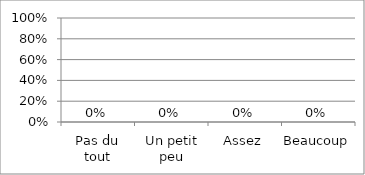
| Category | Series 0 |
|---|---|
| Pas du tout | 0 |
| Un petit peu | 0 |
| Assez | 0 |
| Beaucoup | 0 |